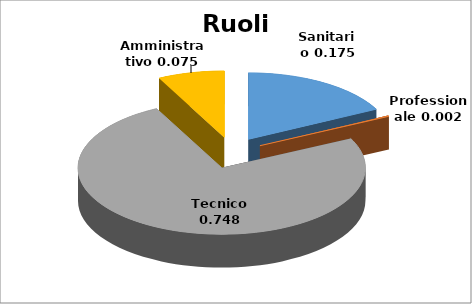
| Category | Series 0 |
|---|---|
| Sanitario | 0.175 |
| Professionale | 0.002 |
| Tecnico | 0.748 |
| Amministrativo | 0.075 |